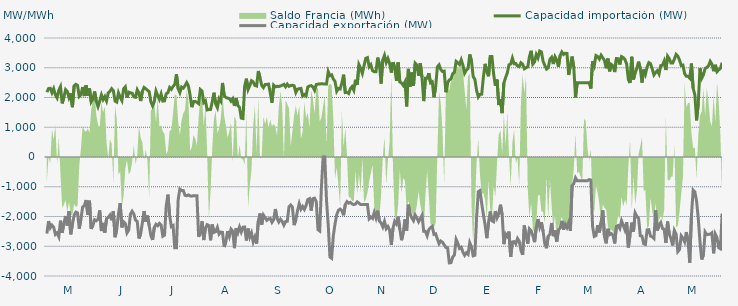
| Category | Capacidad importación (MW) | Capacidad exportación (MW) |
|---|---|---|
| 0 | 2180.625 | -2574 |
| 1900-01-01 | 2300 | -2155.333 |
| 1900-01-02 | 2310.417 | -2380.708 |
| 1900-01-03 | 2160.417 | -2290.5 |
| 1900-01-04 | 2295.833 | -2360.958 |
| 1900-01-05 | 2083.333 | -2603 |
| 1900-01-06 | 1983.333 | -2551.458 |
| 1900-01-07 | 2243.75 | -2680.375 |
| 1900-01-08 | 2364.583 | -2139.583 |
| 1900-01-09 | 1802.083 | -2551.375 |
| 1900-01-10 | 2012.5 | -2222.583 |
| 1900-01-11 | 2264.583 | -1983.333 |
| 1900-01-12 | 2200 | -2304.167 |
| 1900-01-13 | 1991.667 | -1823 |
| 1900-01-14 | 2139.583 | -2598.667 |
| 1900-01-15 | 1674.583 | -2262.5 |
| 1900-01-16 | 2391.667 | -1958.333 |
| 1900-01-17 | 2442.875 | -1852.083 |
| 1900-01-18 | 2406.25 | -1879.167 |
| 1900-01-19 | 2035.417 | -2408.5 |
| 1900-01-20 | 2093.75 | -2077.083 |
| 1900-01-21 | 2353.042 | -1679.167 |
| 1900-01-22 | 2047.917 | -1637.5 |
| 1900-01-23 | 2414.917 | -1445.833 |
| 1900-01-24 | 2054.167 | -1935.417 |
| 1900-01-25 | 2304.167 | -1468.75 |
| 1900-01-26 | 1852.083 | -2413.583 |
| 1900-01-27 | 1950 | -2298.583 |
| 1900-01-28 | 2204.167 | -2108.333 |
| 1900-01-29 | 1870.833 | -2142.875 |
| 1900-01-30 | 1693.75 | -2094.083 |
| 1900-01-31 | 1875 | -1793.75 |
| 1900-02-01 | 2087.5 | -2489.25 |
| 1900-02-02 | 1929.167 | -2216.167 |
| 1900-02-03 | 2031.25 | -2542 |
| 1900-02-04 | 1885.417 | -2072.833 |
| 1900-02-05 | 2156.25 | -2029.167 |
| 1900-02-06 | 2208.333 | -1953 |
| 1900-02-07 | 2297.917 | -2127.083 |
| 1900-02-08 | 2229.167 | -1822.917 |
| 1900-02-09 | 1879.167 | -2695.583 |
| 1900-02-10 | 1845.833 | -2427.667 |
| 1900-02-11 | 2156.25 | -1908.417 |
| 1900-02-12 | 2010.417 | -1551.375 |
| 1900-02-13 | 1897.625 | -2367.333 |
| 1900-02-14 | 2291.667 | -2179.167 |
| 1900-02-15 | 2358.333 | -2236.833 |
| 1900-02-16 | 1997.917 | -2551.708 |
| 1900-02-17 | 2179.167 | -2457.875 |
| 1900-02-18 | 2156.25 | -1922.667 |
| 1900-02-19 | 2145.833 | -1823.917 |
| 1900-02-20 | 2022.917 | -1916.417 |
| 1900-02-21 | 2008.333 | -2121.167 |
| 1900-02-22 | 2260.417 | -2164.667 |
| 1900-02-23 | 2152.083 | -2739.958 |
| 1900-02-24 | 1881 | -2582.833 |
| 1900-02-25 | 2206.25 | -2222.083 |
| 1900-02-26 | 2339.583 | -1816.667 |
| 1900-02-27 | 2293.75 | -2177.833 |
| 1900-02-28 | 2245.833 | -1968.75 |
| 1900-02-28 | 2195.833 | -2304.458 |
| 1900-03-01 | 1858.208 | -2638.917 |
| 1900-03-02 | 1718.75 | -2788.083 |
| 1900-03-03 | 1858.333 | -2369.542 |
| 1900-03-04 | 2216.667 | -2260.583 |
| 1900-03-05 | 2066.667 | -2309.375 |
| 1900-03-06 | 1935.417 | -2231 |
| 1900-03-07 | 2118.292 | -2285.25 |
| 1900-03-08 | 1879.583 | -2663 |
| 1900-03-09 | 1887.5 | -2627.5 |
| 1900-03-10 | 2127.083 | -1647.917 |
| 1900-03-11 | 2162.5 | -1266.667 |
| 1900-03-12 | 2338.667 | -1964.583 |
| 1900-03-13 | 2277.083 | -2337.25 |
| 1900-03-14 | 2373.75 | -2304.167 |
| 1900-03-15 | 2435.083 | -3048.333 |
| 1900-03-16 | 2780.708 | -3048.208 |
| 1900-03-17 | 2300 | -1435 |
| 1900-03-18 | 2164.583 | -1077.083 |
| 1900-03-19 | 2350 | -1125 |
| 1900-03-20 | 2314.583 | -1125 |
| 1900-03-21 | 2395.625 | -1287.5 |
| 1900-03-22 | 2501.583 | -1302.083 |
| 1900-03-23 | 2389.417 | -1275 |
| 1900-03-24 | 2080.375 | -1308.333 |
| 1900-03-25 | 1675 | -1316.667 |
| 1900-03-26 | 1862.5 | -1300 |
| 1900-03-27 | 1866.708 | -1300 |
| 1900-03-28 | 1837.292 | -1300 |
| 1900-03-29 | 1793.75 | -2680.333 |
| 1900-03-30 | 2268.333 | -2563.75 |
| 1900-03-31 | 2217.333 | -2160.333 |
| 1900-04-01 | 1831.25 | -2791.75 |
| 1900-04-02 | 1890.083 | -2386.583 |
| 1900-04-03 | 1581.667 | -2273.25 |
| 1900-04-04 | 1595.833 | -2304.167 |
| 1900-04-05 | 1593.75 | -2799.042 |
| 1900-04-06 | 1860.75 | -2268.667 |
| 1900-04-07 | 2160.5 | -2533.875 |
| 1900-04-08 | 1785.417 | -2508.667 |
| 1900-04-09 | 1658.333 | -2368.167 |
| 1900-04-10 | 1958.333 | -2590.5 |
| 1900-04-11 | 1875.083 | -2522 |
| 1900-04-12 | 2489.792 | -2532.75 |
| 1900-04-13 | 2064.583 | -3024.833 |
| 1900-04-14 | 2001.333 | -2838.125 |
| 1900-04-15 | 1979.167 | -2490.417 |
| 1900-04-16 | 1966.667 | -2671.375 |
| 1900-04-17 | 1877.792 | -2424.333 |
| 1900-04-18 | 1957.75 | -2493.167 |
| 1900-04-19 | 1716.667 | -3063.708 |
| 1900-04-20 | 1978.5 | -2394.708 |
| 1900-04-21 | 1729.167 | -2549 |
| 1900-04-22 | 1666.667 | -2355.5 |
| 1900-04-23 | 1308.333 | -2520.458 |
| 1900-04-24 | 1293.75 | -2359.417 |
| 1900-04-25 | 2383.833 | -2353.167 |
| 1900-04-26 | 2632.25 | -2807.083 |
| 1900-04-27 | 2269.167 | -2407.042 |
| 1900-04-28 | 2400.75 | -2695.042 |
| 1900-04-29 | 2564.417 | -2553.583 |
| 1900-04-30 | 2525.583 | -2853.583 |
| 1900-05-01 | 2404.5 | -2690.292 |
| 1900-05-02 | 2386.042 | -2912.083 |
| 1900-05-03 | 2890.042 | -2155.708 |
| 1900-05-04 | 2668.625 | -1896.5 |
| 1900-05-05 | 2403.083 | -2272.75 |
| 1900-05-06 | 2332.833 | -1950 |
| 1900-05-07 | 2437.5 | -2037.5 |
| 1900-05-08 | 2441.667 | -2129 |
| 1900-05-09 | 2450 | -2079.167 |
| 1900-05-10 | 2159.292 | -2066.667 |
| 1900-05-11 | 1825 | -2195.667 |
| 1900-05-12 | 2412.5 | -2108.333 |
| 1900-05-13 | 2355.5 | -1747.917 |
| 1900-05-14 | 2377.083 | -2070.833 |
| 1900-05-15 | 2366.667 | -2185.333 |
| 1900-05-16 | 2387.5 | -2091.667 |
| 1900-05-17 | 2412.5 | -2164.583 |
| 1900-05-18 | 2443 | -2291.292 |
| 1900-05-19 | 2360.417 | -2168.75 |
| 1900-05-20 | 2450 | -2160.417 |
| 1900-05-21 | 2375 | -1668.75 |
| 1900-05-22 | 2402.083 | -1612.5 |
| 1900-05-23 | 2412 | -1683.333 |
| 1900-05-24 | 2393.75 | -2289.583 |
| 1900-05-25 | 2168.625 | -2114.083 |
| 1900-05-26 | 2281.25 | -1800 |
| 1900-05-27 | 2295.833 | -1566.667 |
| 1900-05-28 | 2306.25 | -1754.167 |
| 1900-05-29 | 2050 | -1662.5 |
| 1900-05-30 | 2100 | -1762.5 |
| 1900-05-31 | 2052.083 | -1629.167 |
| 1900-06-01 | 2351.708 | -1429.167 |
| 1900-06-02 | 2387.5 | -1400 |
| 1900-06-03 | 2400 | -1800 |
| 1900-06-04 | 2355.875 | -1400 |
| 1900-06-05 | 2239.583 | -1383.333 |
| 1900-06-06 | 2435.417 | -1500 |
| 1900-06-07 | 2450 | -2442.875 |
| 1900-06-08 | 2455.875 | -2487.042 |
| 1900-06-09 | 2459.792 | -1025 |
| 1900-06-10 | 2457.708 | 0 |
| 1900-06-11 | 2450 | 0 |
| 1900-06-12 | 2450 | -1462.5 |
| 1900-06-13 | 2870.833 | -2280.5 |
| 1900-06-14 | 2735.958 | -3362.458 |
| 1900-06-15 | 2761.833 | -3404.708 |
| 1900-06-16 | 2618.708 | -2638.958 |
| 1900-06-17 | 2538.583 | -2247.25 |
| 1900-06-18 | 2208.333 | -1933.333 |
| 1900-06-19 | 2304.167 | -1791.667 |
| 1900-06-20 | 2285.083 | -1750 |
| 1900-06-21 | 2485.708 | -1800 |
| 1900-06-22 | 2766.917 | -1958.333 |
| 1900-06-23 | 2164.458 | -1600 |
| 1900-06-24 | 2172.792 | -1500 |
| 1900-06-25 | 2133.333 | -1550 |
| 1900-06-26 | 2297.917 | -1525 |
| 1900-06-27 | 2366.667 | -1575 |
| 1900-06-28 | 2243.25 | -1600 |
| 1900-06-29 | 2598.52 | -1580 |
| 1900-06-30 | 2420.167 | -1508.333 |
| 1900-07-01 | 3106.25 | -1550 |
| 1900-07-02 | 2984.667 | -1600 |
| 1900-07-03 | 2812.083 | -1600 |
| 1900-07-04 | 3067.5 | -1600 |
| 1900-07-05 | 3316.25 | -1600 |
| 1900-07-06 | 3341.25 | -1600 |
| 1900-07-07 | 3032 | -2077.083 |
| 1900-07-08 | 3104.417 | -2016.75 |
| 1900-07-09 | 2900 | -2064.583 |
| 1900-07-10 | 2867 | -1862.5 |
| 1900-07-11 | 2867 | -2045.833 |
| 1900-07-12 | 3341.083 | -1804.167 |
| 1900-07-13 | 3131.083 | -2154.167 |
| 1900-07-14 | 2468.083 | -2216.667 |
| 1900-07-15 | 3265.167 | -2350 |
| 1900-07-16 | 3420.583 | -2164.833 |
| 1900-07-17 | 3174.333 | -2409.417 |
| 1900-07-18 | 3313.292 | -2335.75 |
| 1900-07-19 | 3146.333 | -2455.542 |
| 1900-07-20 | 2838 | -2955.75 |
| 1900-07-21 | 3188.5 | -2388.25 |
| 1900-07-22 | 2992.083 | -2162.5 |
| 1900-07-23 | 2556.125 | -2248.583 |
| 1900-07-24 | 3177.25 | -2002.917 |
| 1900-07-25 | 2521.083 | -2429.667 |
| 1900-07-26 | 2489.167 | -2797.208 |
| 1900-07-27 | 2404.583 | -2531.417 |
| 1900-07-28 | 2519.708 | -2094.75 |
| 1900-07-29 | 1700 | -2472.792 |
| 1900-07-30 | 2961.583 | -1602.083 |
| 1900-07-31 | 2367.125 | -1916.667 |
| 1900-08-01 | 2839.792 | -2043.75 |
| 1900-08-02 | 2395.833 | -2137.5 |
| 1900-08-03 | 3152.583 | -1952.083 |
| 1900-08-04 | 3090.75 | -2052.083 |
| 1900-08-05 | 2732.167 | -2177.083 |
| 1900-08-06 | 3154.208 | -2069.625 |
| 1900-08-07 | 2672.375 | -1960.417 |
| 1900-08-08 | 1879.167 | -2497 |
| 1900-08-09 | 2643.583 | -2497 |
| 1900-08-10 | 2643.083 | -2647.583 |
| 1900-08-11 | 2816.917 | -2441.083 |
| 1900-08-12 | 2493.125 | -2374 |
| 1900-08-13 | 2524.458 | -2332.167 |
| 1900-08-14 | 2008.333 | -2601 |
| 1900-08-15 | 2361.875 | -2582.083 |
| 1900-08-16 | 3027.625 | -2755.833 |
| 1900-08-17 | 3096.375 | -2911.667 |
| 1900-08-18 | 2940.417 | -2822.917 |
| 1900-08-19 | 2875 | -2863.5 |
| 1900-08-20 | 2886.833 | -2951.167 |
| 1900-08-21 | 2177.083 | -3040.5 |
| 1900-08-22 | 2503.583 | -3052 |
| 1900-08-23 | 2591.792 | -3558.75 |
| 1900-08-24 | 2617 | -3551.083 |
| 1900-08-25 | 2801.958 | -3364.542 |
| 1900-08-26 | 2846.25 | -3293 |
| 1900-08-27 | 3214.542 | -2770.875 |
| 1900-08-28 | 3169.167 | -2897.917 |
| 1900-08-29 | 3108.042 | -3073.375 |
| 1900-08-30 | 3266.042 | -3032.75 |
| 1900-08-31 | 3083.708 | -3200.292 |
| 1900-09-01 | 2817.875 | -3304.5 |
| 1900-09-02 | 2919.708 | -3219.583 |
| 1900-09-03 | 2976.042 | -3273.667 |
| 1900-09-04 | 3445.625 | -2880.583 |
| 1900-09-05 | 3231.042 | -3016.625 |
| 1900-09-06 | 2703.75 | -3322.875 |
| 1900-09-07 | 2610.417 | -3303 |
| 1900-09-08 | 2240.75 | -2035 |
| 1900-09-09 | 2016.667 | -1167.583 |
| 1900-09-10 | 2102.083 | -1128.25 |
| 1900-09-11 | 2110.417 | -1558.333 |
| 1900-09-12 | 2691.083 | -1930.667 |
| 1900-09-13 | 3131 | -2286.417 |
| 1900-09-14 | 2867 | -2728 |
| 1900-09-15 | 2713.167 | -2194.5 |
| 1900-09-16 | 3375.5 | -1833.333 |
| 1900-09-17 | 3377.833 | -2144.5 |
| 1900-09-18 | 2788.375 | -2175 |
| 1900-09-19 | 2393.917 | -1818.5 |
| 1900-09-20 | 2602.208 | -2041.542 |
| 1900-09-21 | 1745.833 | -1898.542 |
| 1900-09-22 | 1941.667 | -1603.542 |
| 1900-09-23 | 1475 | -1942.833 |
| 1900-09-24 | 2488.208 | -2928.792 |
| 1900-09-25 | 2665.583 | -2587.083 |
| 1900-09-26 | 2824.833 | -2666.708 |
| 1900-09-27 | 3099 | -2507.042 |
| 1900-09-28 | 3125.208 | -3352.792 |
| 1900-09-29 | 3325.625 | -2855.792 |
| 1900-09-30 | 3135.042 | -2844.083 |
| 1900-10-01 | 3141.667 | -2918 |
| 1900-10-02 | 3059.917 | -2739.5 |
| 1900-10-03 | 3034.833 | -2828 |
| 1900-10-04 | 3167.5 | -3136.792 |
| 1900-10-05 | 3121.167 | -3287.208 |
| 1900-10-06 | 2964.583 | -2300 |
| 1900-10-07 | 3002.167 | -2654.417 |
| 1900-10-08 | 3029.042 | -2917.583 |
| 1900-10-09 | 3379.625 | -2416.083 |
| 1900-10-10 | 3570.333 | -2480.292 |
| 1900-10-11 | 3123.292 | -2647.208 |
| 1900-10-12 | 3196.583 | -2862.417 |
| 1900-10-13 | 3445.458 | -2378.958 |
| 1900-10-14 | 3328.083 | -2087.5 |
| 1900-10-15 | 3561 | -2358.667 |
| 1900-10-16 | 3532.125 | -2190.458 |
| 1900-10-17 | 3219.792 | -2497 |
| 1900-10-18 | 3077.292 | -2917.833 |
| 1900-10-19 | 2955.75 | -3065.375 |
| 1900-10-20 | 2997.958 | -2665.292 |
| 1900-10-21 | 3285.292 | -2594.75 |
| 1900-10-22 | 3350.708 | -2217.75 |
| 1900-10-23 | 3125.292 | -2661.542 |
| 1900-10-24 | 3368.292 | -2470.583 |
| 1900-10-25 | 3260.167 | -2844.375 |
| 1900-10-26 | 3034.708 | -2450.625 |
| 1900-10-27 | 3410.458 | -2385 |
| 1900-10-28 | 3529.958 | -2146.167 |
| 1900-10-29 | 3445.25 | -2443.125 |
| 1900-10-30 | 3489.542 | -2260.25 |
| 1900-10-31 | 3481.833 | -2370.583 |
| 1900-11-01 | 2757.125 | -2206.25 |
| 1900-11-02 | 3080.958 | -2481.667 |
| 1900-11-03 | 3376 | -966.667 |
| 1900-11-04 | 3018.208 | -895.833 |
| 1900-11-05 | 2000 | -700 |
| 1900-11-06 | 2497 | -800 |
| 1900-11-07 | 2497 | -800 |
| 1900-11-08 | 2497 | -800 |
| 1900-11-09 | 2497 | -800 |
| 1900-11-10 | 2497 | -800 |
| 1900-11-11 | 2497 | -800 |
| 1900-11-12 | 2497 | -800 |
| 1900-11-13 | 2497 | -758.333 |
| 1900-11-14 | 2300 | -775 |
| 1900-11-15 | 3213.417 | -2319.542 |
| 1900-11-16 | 3069.417 | -2670.458 |
| 1900-11-17 | 3409.708 | -2642.25 |
| 1900-11-18 | 3375.792 | -2289.292 |
| 1900-11-19 | 3289.583 | -2534.75 |
| 1900-11-20 | 3422.208 | -2195.833 |
| 1900-11-21 | 3333.625 | -1791.167 |
| 1900-11-22 | 3246.917 | -2683.292 |
| 1900-11-23 | 2982.792 | -2900.958 |
| 1900-11-24 | 3308.458 | -2412.833 |
| 1900-11-25 | 2878.875 | -2610.083 |
| 1900-11-26 | 3112.042 | -2575.917 |
| 1900-11-27 | 3061.417 | -2634.458 |
| 1900-11-28 | 2855.167 | -2904.792 |
| 1900-11-29 | 3308.833 | -2329.167 |
| 1900-11-30 | 3303.652 | -2303.826 |
| 1900-12-01 | 3110.167 | -2403.208 |
| 1900-12-02 | 3376.167 | -2144.417 |
| 1900-12-03 | 3343.5 | -2295.25 |
| 1900-12-04 | 3275.917 | -2451.667 |
| 1900-12-05 | 3127.583 | -2190.25 |
| 1900-12-06 | 2605.25 | -3040.667 |
| 1900-12-07 | 2486.458 | -2615.667 |
| 1900-12-08 | 3368.375 | -2205.958 |
| 1900-12-09 | 2603.458 | -2511.75 |
| 1900-12-10 | 2832.708 | -1881.25 |
| 1900-12-11 | 2981 | -1991.667 |
| 1900-12-12 | 3204.667 | -2060.667 |
| 1900-12-13 | 2973.333 | -2647.542 |
| 1900-12-14 | 2500.042 | -2659.542 |
| 1900-12-15 | 2939.542 | -2916.042 |
| 1900-12-16 | 2780.917 | -2938.917 |
| 1900-12-17 | 3025.5 | -2450.25 |
| 1900-12-18 | 3172 | -2443 |
| 1900-12-19 | 3135.333 | -2660.625 |
| 1900-12-20 | 2961.375 | -2681.167 |
| 1900-12-21 | 2757.667 | -2739.333 |
| 1900-12-22 | 2839.708 | -1792.708 |
| 1900-12-23 | 2900.083 | -2470.708 |
| 1900-12-24 | 2788.25 | -2287.5 |
| 1900-12-25 | 3073.458 | -2203.667 |
| 1900-12-26 | 3085.417 | -2401.042 |
| 1900-12-27 | 3223.958 | -2429.333 |
| 1900-12-28 | 2923.667 | -2890.167 |
| 1900-12-29 | 3389.417 | -2170.833 |
| 1900-12-30 | 3304.833 | -2587.25 |
| 1900-12-31 | 3160.208 | -2749.333 |
| 1901-01-01 | 3157.208 | -2972.458 |
| 1901-01-02 | 3291.25 | -2470.083 |
| 1901-01-03 | 3451.125 | -2591.25 |
| 1901-01-04 | 3391.458 | -3180.792 |
| 1901-01-05 | 3260.583 | -3111.375 |
| 1901-01-06 | 3075.667 | -2648.833 |
| 1901-01-07 | 3089.125 | -2729.083 |
| 1901-01-08 | 2799.167 | -2851.792 |
| 1901-01-09 | 2712.792 | -2523.583 |
| 1901-01-10 | 2715.583 | -2834.458 |
| 1901-01-11 | 2649.75 | -3553.875 |
| 1901-01-12 | 3142 | -1958.583 |
| 1901-01-13 | 2309.333 | -1112.5 |
| 1901-01-14 | 2092.708 | -1172.917 |
| 1901-01-15 | 1233.333 | -1479.167 |
| 1901-01-16 | 1801.375 | -2064.167 |
| 1901-01-17 | 2984.25 | -2845.375 |
| 1901-01-18 | 2642.625 | -3444.292 |
| 1901-01-19 | 2756.708 | -3297.292 |
| 1901-01-20 | 2976.167 | -2519.583 |
| 1901-01-21 | 3007.625 | -2609.833 |
| 1901-01-22 | 3069.708 | -2601.375 |
| 1901-01-23 | 3216.333 | -2593.917 |
| 1901-01-24 | 3121.917 | -2548.542 |
| 1901-01-25 | 2884.625 | -3236.75 |
| 1901-01-26 | 3099.083 | -2592.208 |
| 1901-01-27 | 2868.458 | -2713.542 |
| 1901-01-28 | 2929.083 | -3048.5 |
| 1901-01-29 | 2980.958 | -3084.375 |
| 1901-01-30 | 3169.875 | -1903.208 |